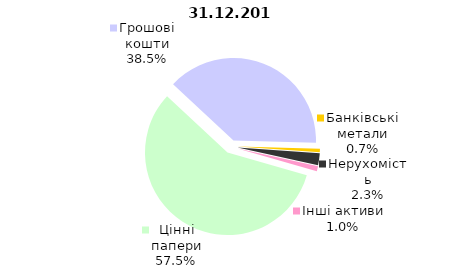
| Category | Всього |
|---|---|
| Цінні папери | 783.998 |
| Грошові кошти | 525.169 |
| Банківські метали | 9.809 |
| Нерухомість | 31.721 |
| Інші активи | 13.441 |